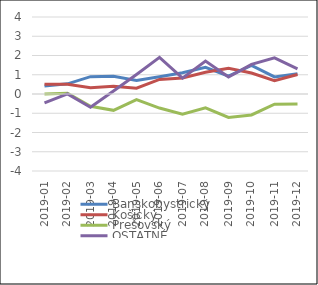
| Category | Banskobystrický | Košický | Prešovský | OSTATNÉ |
|---|---|---|---|---|
| 2019-01 | 0.413 | 0.5 | 0.001 | -0.464 |
| 2019-02 | 0.527 | 0.5 | 0.037 | 0.002 |
| 2019-03 | 0.901 | 0.328 | -0.641 | -0.688 |
| 2019-04 | 0.921 | 0.403 | -0.848 | 0.155 |
| 2019-05 | 0.704 | 0.305 | -0.288 | 1.012 |
| 2019-06 | 0.901 | 0.756 | -0.729 | 1.903 |
| 2019-07 | 1.102 | 0.833 | -1.043 | 0.823 |
| 2019-08 | 1.382 | 1.133 | -0.721 | 1.715 |
| 2019-09 | 0.929 | 1.334 | -1.214 | 0.883 |
| 2019-10 | 1.487 | 1.091 | -1.09 | 1.539 |
| 2019-11 | 0.887 | 0.694 | -0.527 | 1.877 |
| 2019-12 | 1.051 | 1.012 | -0.514 | 1.306 |